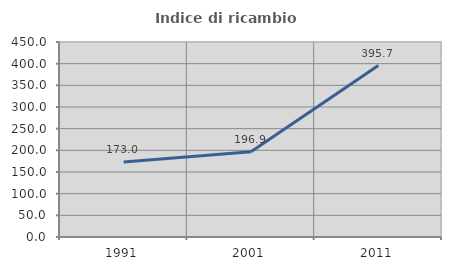
| Category | Indice di ricambio occupazionale  |
|---|---|
| 1991.0 | 172.956 |
| 2001.0 | 196.947 |
| 2011.0 | 395.652 |